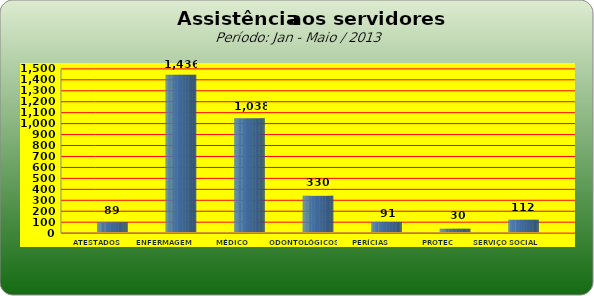
| Category | Series 0 |
|---|---|
| ATESTADOS MÉDICOS | 89 |
| ENFERMAGEM | 1436 |
| MÉDICO | 1038 |
| ODONTOLÓGICOS | 330 |
| PERÍCIAS MÉDICAS | 91 |
| PROTEC | 30 |
| SERVIÇO SOCIAL | 112 |